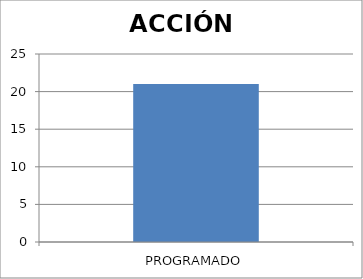
| Category | ACCIÓN |
|---|---|
| PROGRAMADO | 21 |